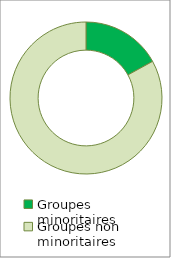
| Category | Series 0 |
|---|---|
| Groupes minoritaires | 0.17 |
| Groupes non minoritaires | 0.83 |